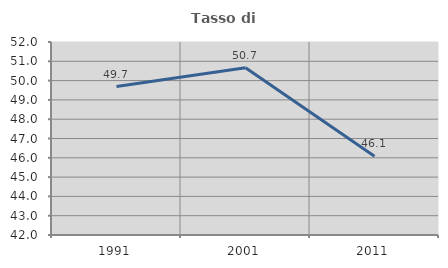
| Category | Tasso di occupazione   |
|---|---|
| 1991.0 | 49.693 |
| 2001.0 | 50.662 |
| 2011.0 | 46.083 |